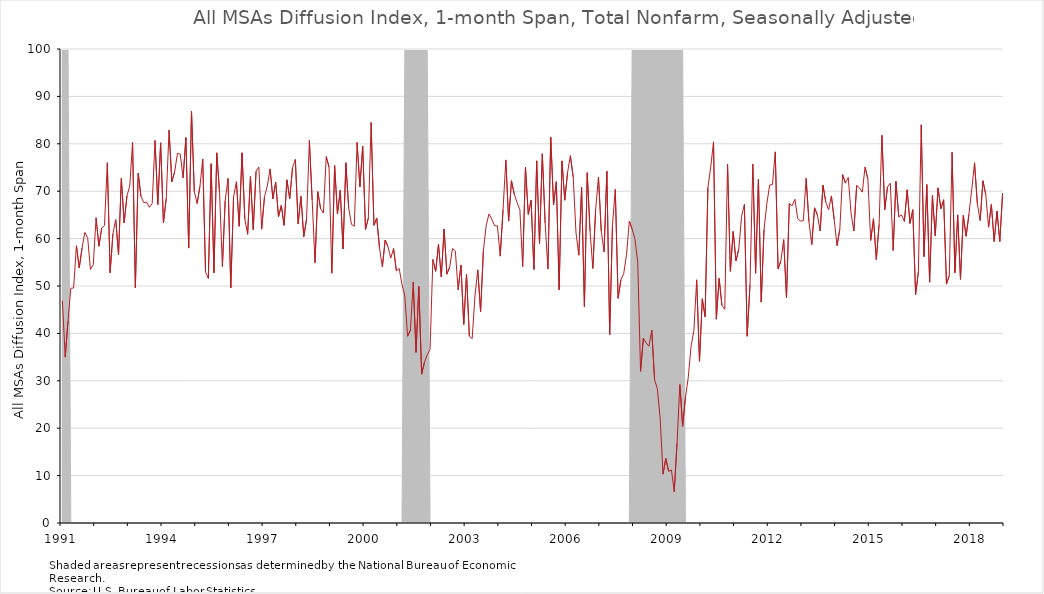
| Category | DI_1month |
|---|---|
| 1991 | 46.9 |
| 1991 | 35 |
| 1991 | 42.7 |
| 1991 | 49.5 |
| 1991 | 49.6 |
| 1991 | 58.5 |
| 1991 | 53.8 |
| 1991 | 58 |
| 1991 | 61.3 |
| 1991 | 60.2 |
| 1991 | 53.5 |
| 1991 | 54.5 |
| 1992 | 64.4 |
| 1992 | 58.4 |
| 1992 | 62.2 |
| 1992 | 62.8 |
| 1992 | 76 |
| 1992 | 52.8 |
| 1992 | 61 |
| 1992 | 64 |
| 1992 | 56.6 |
| 1992 | 72.7 |
| 1992 | 63.3 |
| 1992 | 69 |
| 1993 | 71.1 |
| 1993 | 80.3 |
| 1993 | 49.6 |
| 1993 | 73.8 |
| 1993 | 68.9 |
| 1993 | 67.6 |
| 1993 | 67.7 |
| 1993 | 66.6 |
| 1993 | 67.4 |
| 1993 | 80.7 |
| 1993 | 67.2 |
| 1993 | 80.2 |
| 1994 | 63.3 |
| 1994 | 68.5 |
| 1994 | 82.9 |
| 1994 | 72 |
| 1994 | 74.1 |
| 1994 | 78 |
| 1994 | 77.8 |
| 1994 | 72.8 |
| 1994 | 81.3 |
| 1994 | 58 |
| 1994 | 86.9 |
| 1994 | 69.9 |
| 1995 | 67.4 |
| 1995 | 71 |
| 1995 | 76.8 |
| 1995 | 53 |
| 1995 | 51.6 |
| 1995 | 75.8 |
| 1995 | 52.8 |
| 1995 | 78.1 |
| 1995 | 69.7 |
| 1995 | 54.1 |
| 1995 | 68 |
| 1995 | 72.7 |
| 1996 | 49.6 |
| 1996 | 68.9 |
| 1996 | 72 |
| 1996 | 62.6 |
| 1996 | 78.1 |
| 1996 | 64.1 |
| 1996 | 60.9 |
| 1996 | 73.1 |
| 1996 | 61.9 |
| 1996 | 74.2 |
| 1996 | 75.1 |
| 1996 | 62 |
| 1997 | 68.8 |
| 1997 | 71.1 |
| 1997 | 74.7 |
| 1997 | 68.4 |
| 1997 | 71.9 |
| 1997 | 64.6 |
| 1997 | 67 |
| 1997 | 62.8 |
| 1997 | 72.4 |
| 1997 | 68.4 |
| 1997 | 75 |
| 1997 | 76.7 |
| 1998 | 63.1 |
| 1998 | 68.9 |
| 1998 | 60.4 |
| 1998 | 64.1 |
| 1998 | 80.7 |
| 1998 | 68.1 |
| 1998 | 54.9 |
| 1998 | 69.9 |
| 1998 | 66.3 |
| 1998 | 65.4 |
| 1998 | 77.3 |
| 1998 | 75.1 |
| 1999 | 52.7 |
| 1999 | 75.4 |
| 1999 | 65.2 |
| 1999 | 70.2 |
| 1999 | 57.8 |
| 1999 | 76 |
| 1999 | 66.5 |
| 1999 | 63 |
| 1999 | 62.6 |
| 1999 | 80.3 |
| 1999 | 70.9 |
| 1999 | 79.5 |
| 2000 | 61.9 |
| 2000 | 64.3 |
| 2000 | 84.5 |
| 2000 | 62.8 |
| 2000 | 64.3 |
| 2000 | 58 |
| 2000 | 54 |
| 2000 | 59.7 |
| 2000 | 58.3 |
| 2000 | 55.9 |
| 2000 | 57.9 |
| 2000 | 53.2 |
| 2001 | 53.7 |
| 2001 | 50.3 |
| 2001 | 47.9 |
| 2001 | 39.4 |
| 2001 | 40.7 |
| 2001 | 50.8 |
| 2001 | 36 |
| 2001 | 49.9 |
| 2001 | 31.4 |
| 2001 | 33.9 |
| 2001 | 35.5 |
| 2001 | 36.6 |
| 2002 | 55.6 |
| 2002 | 53.1 |
| 2002 | 58.8 |
| 2002 | 51.9 |
| 2002 | 62 |
| 2002 | 52.5 |
| 2002 | 54 |
| 2002 | 57.9 |
| 2002 | 57.4 |
| 2002 | 49.2 |
| 2002 | 54.4 |
| 2002 | 41.9 |
| 2003 | 52.5 |
| 2003 | 39.4 |
| 2003 | 38.9 |
| 2003 | 47.9 |
| 2003 | 53.4 |
| 2003 | 44.6 |
| 2003 | 57.4 |
| 2003 | 62.8 |
| 2003 | 65.2 |
| 2003 | 64.1 |
| 2003 | 62.7 |
| 2003 | 62.7 |
| 2004 | 56.3 |
| 2004 | 66.1 |
| 2004 | 76.6 |
| 2004 | 63.7 |
| 2004 | 72.2 |
| 2004 | 69.4 |
| 2004 | 67.6 |
| 2004 | 66.1 |
| 2004 | 54.1 |
| 2004 | 75.1 |
| 2004 | 65.1 |
| 2004 | 68.1 |
| 2005 | 53.5 |
| 2005 | 76.4 |
| 2005 | 58.9 |
| 2005 | 77.9 |
| 2005 | 63.3 |
| 2005 | 53.6 |
| 2005 | 81.4 |
| 2005 | 67.1 |
| 2005 | 72 |
| 2005 | 49.2 |
| 2005 | 76.4 |
| 2005 | 68.1 |
| 2006 | 74 |
| 2006 | 77.5 |
| 2006 | 73 |
| 2006 | 61.2 |
| 2006 | 56.5 |
| 2006 | 70.8 |
| 2006 | 45.6 |
| 2006 | 73.9 |
| 2006 | 61.6 |
| 2006 | 53.7 |
| 2006 | 66.1 |
| 2006 | 73 |
| 2007 | 61.6 |
| 2007 | 57.2 |
| 2007 | 74.2 |
| 2007 | 39.7 |
| 2007 | 62.9 |
| 2007 | 70.4 |
| 2007 | 47.4 |
| 2007 | 51.3 |
| 2007 | 52.6 |
| 2007 | 56.6 |
| 2007 | 63.7 |
| 2007 | 62 |
| 2008 | 59.9 |
| 2008 | 55 |
| 2008 | 32 |
| 2008 | 39 |
| 2008 | 38 |
| 2008 | 37.3 |
| 2008 | 40.7 |
| 2008 | 30.2 |
| 2008 | 28.3 |
| 2008 | 22 |
| 2008 | 10.3 |
| 2008 | 13.6 |
| 2009 | 10.9 |
| 2009 | 11.2 |
| 2009 | 6.6 |
| 2009 | 16.8 |
| 2009 | 29.2 |
| 2009 | 20.4 |
| 2009 | 26.5 |
| 2009 | 30.7 |
| 2009 | 37.3 |
| 2009 | 40.6 |
| 2009 | 51.3 |
| 2009 | 34.1 |
| 2010 | 47.3 |
| 2010 | 43.5 |
| 2010 | 70.8 |
| 2010 | 75.1 |
| 2010 | 80.4 |
| 2010 | 43 |
| 2010 | 51.6 |
| 2010 | 45.9 |
| 2010 | 45.1 |
| 2010 | 75.7 |
| 2010 | 53.1 |
| 2010 | 61.5 |
| 2011 | 55.3 |
| 2011 | 57.8 |
| 2011 | 64.7 |
| 2011 | 67.2 |
| 2011 | 39.4 |
| 2011 | 50.3 |
| 2011 | 75.7 |
| 2011 | 52.7 |
| 2011 | 72.5 |
| 2011 | 46.6 |
| 2011 | 61.9 |
| 2011 | 67.4 |
| 2012 | 71.3 |
| 2012 | 71.4 |
| 2012 | 78.3 |
| 2012 | 53.6 |
| 2012 | 55.3 |
| 2012 | 59.8 |
| 2012 | 47.5 |
| 2012 | 67.4 |
| 2012 | 66.9 |
| 2012 | 68.3 |
| 2012 | 64.2 |
| 2012 | 63.7 |
| 2013 | 63.8 |
| 2013 | 72.7 |
| 2013 | 63.6 |
| 2013 | 58.7 |
| 2013 | 66.5 |
| 2013 | 65 |
| 2013 | 61.6 |
| 2013 | 71.3 |
| 2013 | 67.7 |
| 2013 | 66.1 |
| 2013 | 69 |
| 2013 | 64 |
| 2014 | 58.5 |
| 2014 | 62 |
| 2014 | 73.5 |
| 2014 | 71.7 |
| 2014 | 72.9 |
| 2014 | 65.4 |
| 2014 | 61.6 |
| 2014 | 71.2 |
| 2014 | 70.7 |
| 2014 | 69.8 |
| 2014 | 75.1 |
| 2014 | 72.5 |
| 2015 | 59.6 |
| 2015 | 64.2 |
| 2015 | 55.6 |
| 2015 | 63 |
| 2015 | 81.8 |
| 2015 | 66.1 |
| 2015 | 70.9 |
| 2015 | 71.7 |
| 2015 | 57.5 |
| 2015 | 72.1 |
| 2015 | 64.6 |
| 2015 | 65 |
| 2016 | 63.6 |
| 2016 | 70.3 |
| 2016 | 63.2 |
| 2016 | 66.1 |
| 2016 | 48.2 |
| 2016 | 53 |
| 2016 | 84 |
| 2016 | 56.2 |
| 2016 | 71.4 |
| 2016 | 50.8 |
| 2016 | 69.1 |
| 2016 | 60.6 |
| 2017 | 70.7 |
| 2017 | 66.3 |
| 2017 | 68.2 |
| 2017 | 50.4 |
| 2017 | 52.2 |
| 2017 | 78.2 |
| 2017 | 52.8 |
| 2017 | 65 |
| 2017 | 51.4 |
| 2017 | 64.9 |
| 2017 | 60.5 |
| 2017 | 65.1 |
| 2018 | 70.3 |
| 2018 | 76 |
| 2018 | 67.4 |
| 2018 | 63.8 |
| 2018 | 72.2 |
| 2018 | 69.3 |
| 2018 | 62.4 |
| 2018 | 67.2 |
| 2018 | 59.4 |